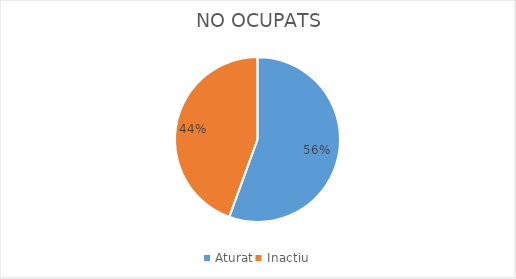
| Category | Series 0 |
|---|---|
| Aturat | 5 |
| Inactiu | 4 |